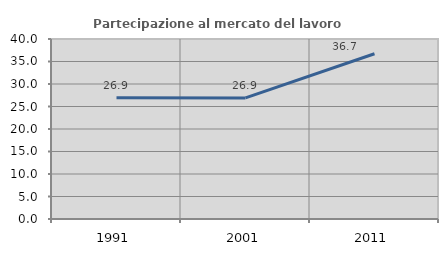
| Category | Partecipazione al mercato del lavoro  femminile |
|---|---|
| 1991.0 | 26.924 |
| 2001.0 | 26.917 |
| 2011.0 | 36.715 |